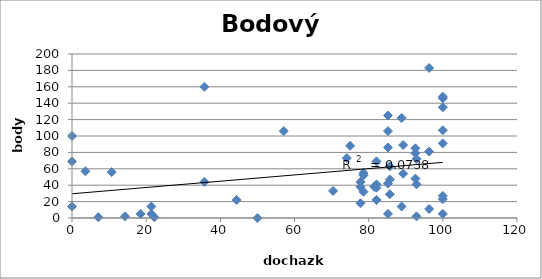
| Category | body |
|---|---|
| 70.4 | 33 |
| 100.0 | 135 |
| 92.6 | 79 |
| 85.2 | 42 |
| 100.0 | 27 |
| 88.9 | 14 |
| 96.3 | 183 |
| 85.2 | 5 |
| 96.3 | 11 |
| 85.2 | 86 |
| 92.6 | 85 |
| 100.0 | 146 |
| 77.8 | 18 |
| 44.4 | 22 |
| 77.8 | 38 |
| 88.9 | 122 |
| 92.6 | 48 |
| 18.5 | 5 |
| 81.5 | 38 |
| 96.3 | 81 |
| 85.2 | 125 |
| 85.2 | 106 |
| 77.8 | 44 |
| 100.0 | 107 |
| 74.1 | 73 |
| 22.2 | 1 |
| 10.7 | 56 |
| 21.4 | 5 |
| 85.7 | 47 |
| 85.7 | 63 |
| 100.0 | 23 |
| 0.0 | 100 |
| 35.7 | 160 |
| 50.0 | 0 |
| 100.0 | 5 |
| 78.6 | 32 |
| 3.6 | 57 |
| 7.1 | 1 |
| 89.3 | 89 |
| 82.1 | 22 |
| 21.4 | 14 |
| 82.1 | 22 |
| 0.0 | 14 |
| 35.7 | 44 |
| 85.7 | 29 |
| 0.0 | 69 |
| 92.9 | 72 |
| 57.1 | 106 |
| 82.1 | 37 |
| 82.1 | 41 |
| 92.9 | 41 |
| 82.1 | 69 |
| 92.9 | 2 |
| 75.0 | 88 |
| 100.0 | 148 |
| 78.6 | 55 |
| 78.6 | 52 |
| 100.0 | 91 |
| 89.3 | 54 |
| 14.3 | 2 |